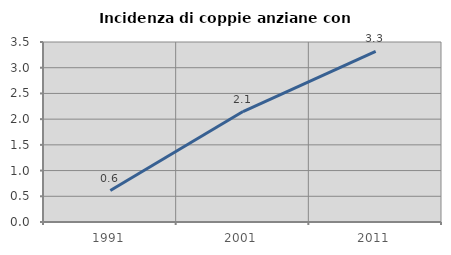
| Category | Incidenza di coppie anziane con figli |
|---|---|
| 1991.0 | 0.612 |
| 2001.0 | 2.147 |
| 2011.0 | 3.316 |